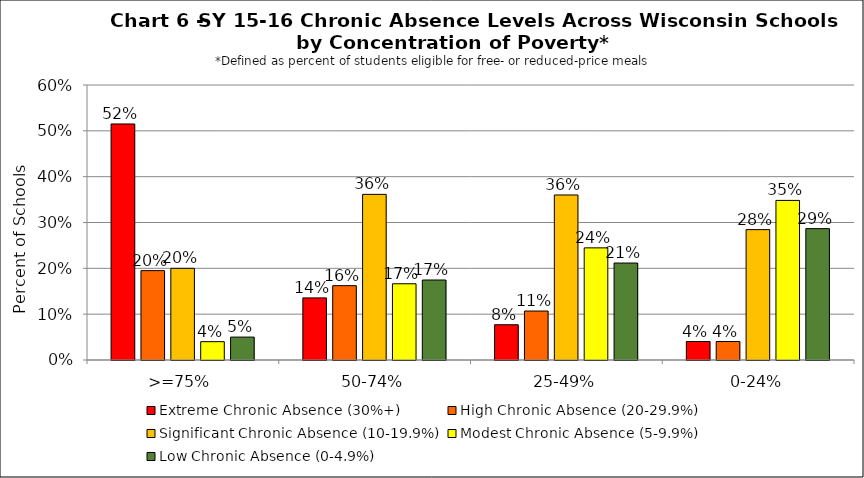
| Category | Extreme Chronic Absence (30%+) | High Chronic Absence (20-29.9%) | Significant Chronic Absence (10-19.9%) | Modest Chronic Absence (5-9.9%) | Low Chronic Absence (0-4.9%) |
|---|---|---|---|---|---|
| 0 | 0.515 | 0.195 | 0.2 | 0.04 | 0.05 |
| 1 | 0.136 | 0.162 | 0.361 | 0.166 | 0.175 |
| 2 | 0.077 | 0.107 | 0.36 | 0.245 | 0.212 |
| 3 | 0.04 | 0.04 | 0.285 | 0.348 | 0.287 |